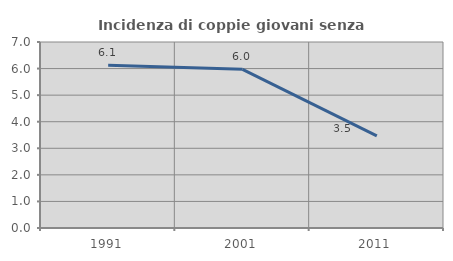
| Category | Incidenza di coppie giovani senza figli |
|---|---|
| 1991.0 | 6.122 |
| 2001.0 | 5.97 |
| 2011.0 | 3.465 |